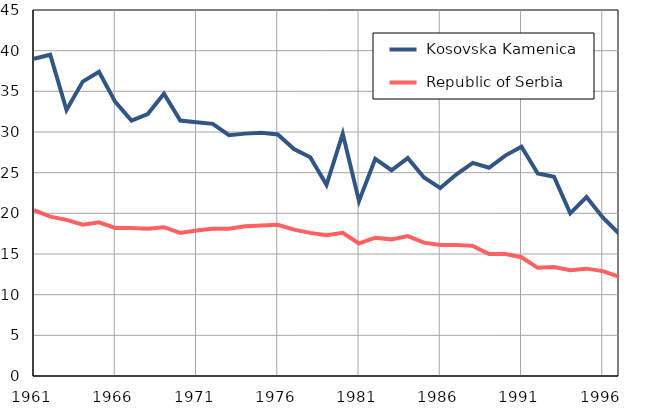
| Category |  Kosovska Kamenica |  Republic of Serbia |
|---|---|---|
| 1961.0 | 39 | 20.4 |
| 1962.0 | 39.5 | 19.6 |
| 1963.0 | 32.7 | 19.2 |
| 1964.0 | 36.2 | 18.6 |
| 1965.0 | 37.4 | 18.9 |
| 1966.0 | 33.7 | 18.2 |
| 1967.0 | 31.4 | 18.2 |
| 1968.0 | 32.2 | 18.1 |
| 1969.0 | 34.7 | 18.3 |
| 1970.0 | 31.4 | 17.6 |
| 1971.0 | 31.2 | 17.9 |
| 1972.0 | 31 | 18.1 |
| 1973.0 | 29.6 | 18.1 |
| 1974.0 | 29.8 | 18.4 |
| 1975.0 | 29.9 | 18.5 |
| 1976.0 | 29.7 | 18.6 |
| 1977.0 | 27.9 | 18 |
| 1978.0 | 26.9 | 17.6 |
| 1979.0 | 23.5 | 17.3 |
| 1980.0 | 29.8 | 17.6 |
| 1981.0 | 21.5 | 16.3 |
| 1982.0 | 26.7 | 17 |
| 1983.0 | 25.3 | 16.8 |
| 1984.0 | 26.8 | 17.2 |
| 1985.0 | 24.4 | 16.4 |
| 1986.0 | 23.1 | 16.1 |
| 1987.0 | 24.8 | 16.1 |
| 1988.0 | 26.2 | 16 |
| 1989.0 | 25.6 | 15 |
| 1990.0 | 27.1 | 15 |
| 1991.0 | 28.2 | 14.6 |
| 1992.0 | 24.9 | 13.3 |
| 1993.0 | 24.5 | 13.4 |
| 1994.0 | 20 | 13 |
| 1995.0 | 22 | 13.2 |
| 1996.0 | 19.5 | 12.9 |
| 1997.0 | 17.5 | 12.2 |